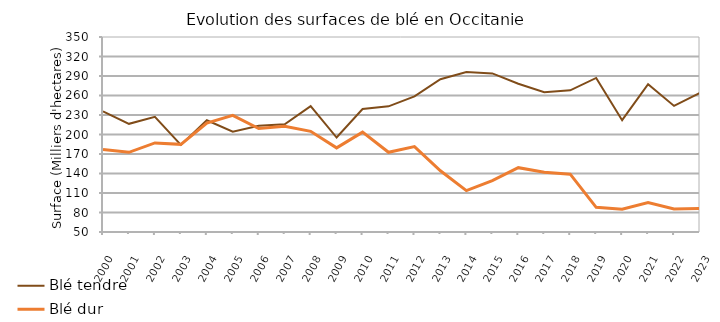
| Category | Blé tendre | Blé dur |
|---|---|---|
| 2000-01-01 | 235.54 | 176.941 |
| 2001-01-01 | 216.422 | 172.572 |
| 2002-01-01 | 227.13 | 187.007 |
| 2003-01-01 | 184.06 | 184.818 |
| 2004-01-01 | 221.899 | 217.563 |
| 2005-01-01 | 204.197 | 229.52 |
| 2006-01-01 | 213.56 | 209.151 |
| 2007-01-01 | 215.636 | 212.746 |
| 2008-01-01 | 243.689 | 204.92 |
| 2009-01-01 | 195.345 | 179.425 |
| 2010-01-01 | 239.199 | 203.597 |
| 2011-01-01 | 243.296 | 172.604 |
| 2012-01-01 | 258.573 | 181.437 |
| 2013-01-01 | 285.078 | 144.184 |
| 2014-01-01 | 296 | 113.7 |
| 2015-01-01 | 294 | 129 |
| 2016-01-01 | 278 | 149 |
| 2017-01-02 | 265 | 142 |
| 2018-01-03 | 268 | 139 |
| 2019-01-03 | 287 | 88 |
| 2020-01-02 | 222 | 85 |
| 1905-07-13 | 277.5 | 95.5 |
| 1905-07-14 | 244 | 85.4 |
| 1905-07-15 | 264 | 86 |